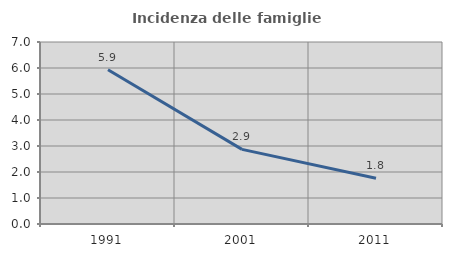
| Category | Incidenza delle famiglie numerose |
|---|---|
| 1991.0 | 5.933 |
| 2001.0 | 2.87 |
| 2011.0 | 1.761 |